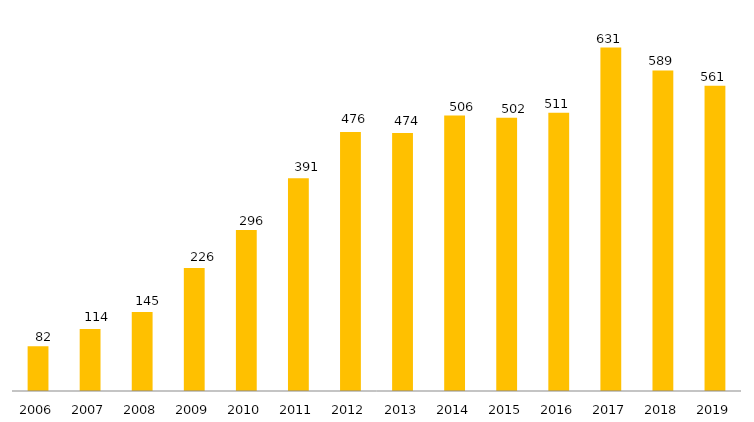
| Category | Programa |
|---|---|
| 2006.0 | 82 |
| 2007.0 | 114 |
| 2008.0 | 145 |
| 2009.0 | 226 |
| 2010.0 | 296 |
| 2011.0 | 391 |
| 2012.0 | 476 |
| 2013.0 | 474 |
| 2014.0 | 506 |
| 2015.0 | 502 |
| 2016.0 | 511 |
| 2017.0 | 631 |
| 2018.0 | 589 |
| 2019.0 | 561 |